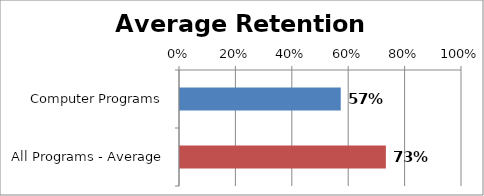
| Category | RetentionRate |
|---|---|
| Computer Programs | 0.57 |
| All Programs - Average | 0.73 |